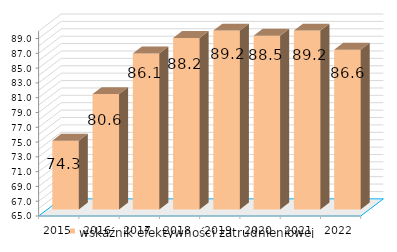
| Category | wskaźnik efektywności zatrudnieniowej |
|---|---|
| 2015.0 | 74.3 |
| 2016.0 | 80.6 |
| 2017.0 | 86.1 |
| 2018.0 | 88.2 |
| 2019.0 | 89.2 |
| 2020.0 | 88.5 |
| 2021.0 | 89.2 |
| 2022.0 | 86.6 |